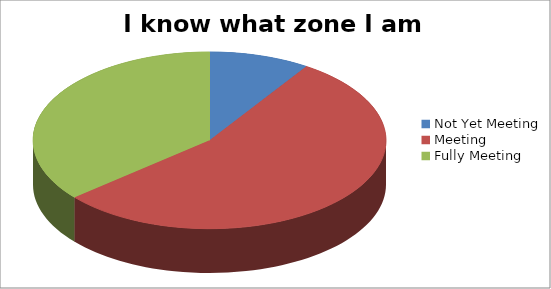
| Category | I know what zone I am in |
|---|---|
| Not Yet Meeting | 13 |
| Meeting | 77 |
| Fully Meeting | 51 |